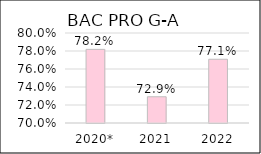
| Category | BAC PRO G-A |
|---|---|
| 2020* | 0.782 |
| 2021 | 0.729 |
| 2022 | 0.771 |